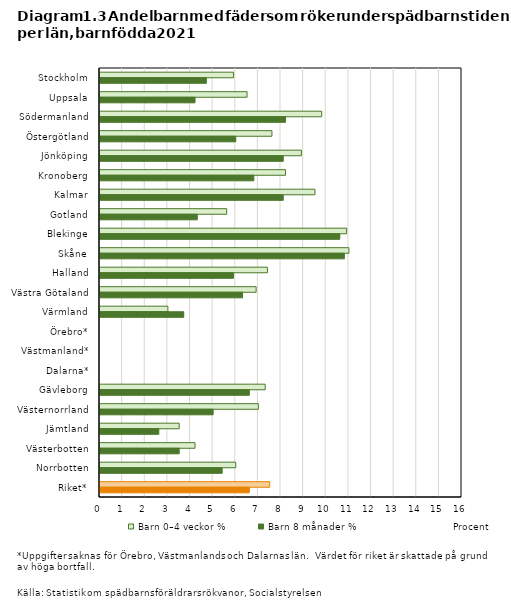
| Category | Barn 0–4 veckor % | Barn 8 månader % |
|---|---|---|
| Stockholm | 5.9 | 4.7 |
| Uppsala | 6.5 | 4.2 |
| Södermanland | 9.8 | 8.2 |
| Östergötland | 7.6 | 6 |
| Jönköping | 8.9 | 8.1 |
| Kronoberg | 8.2 | 6.8 |
| Kalmar | 9.5 | 8.1 |
| Gotland | 5.6 | 4.3 |
| Blekinge | 10.9 | 10.6 |
| Skåne | 11 | 10.8 |
| Halland | 7.4 | 5.9 |
| Västra Götaland | 6.9 | 6.3 |
| Värmland | 3 | 3.7 |
| Örebro* | 0 | 0 |
| Västmanland* | 0 | 0 |
| Dalarna* | 0 | 0 |
| Gävleborg | 7.3 | 6.6 |
| Västernorrland | 7 | 5 |
| Jämtland | 3.5 | 2.6 |
| Västerbotten | 4.2 | 3.5 |
| Norrbotten | 6 | 5.4 |
| Riket* | 7.5 | 6.6 |